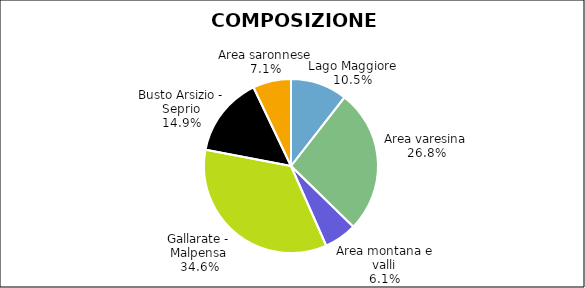
| Category | Series 0 |
|---|---|
| Lago Maggiore | 2107 |
| Area varesina | 5351 |
| Area montana e valli | 1216 |
| Gallarate - Malpensa | 6925 |
| Busto Arsizio - Seprio | 2985 |
| Area saronnese | 1416 |